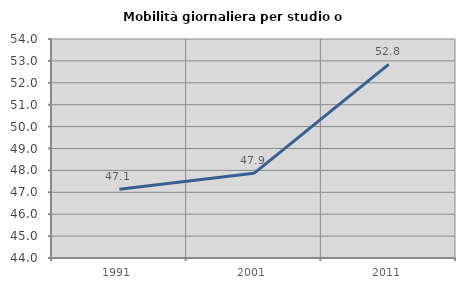
| Category | Mobilità giornaliera per studio o lavoro |
|---|---|
| 1991.0 | 47.144 |
| 2001.0 | 47.865 |
| 2011.0 | 52.842 |